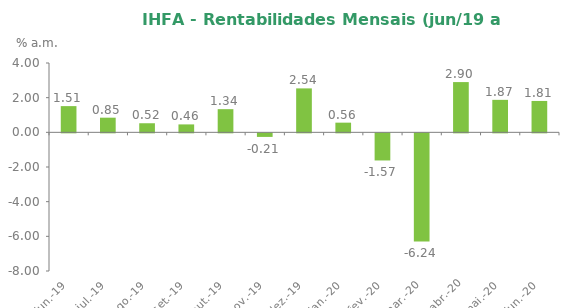
| Category | Series 0 |
|---|---|
| 2019-06-30 | 1.513 |
| 2019-07-31 | 0.845 |
| 2019-08-31 | 0.524 |
| 2019-09-30 | 0.457 |
| 2019-10-31 | 1.337 |
| 2019-11-30 | -0.207 |
| 2019-12-31 | 2.535 |
| 2020-01-31 | 0.558 |
| 2020-02-29 | -1.565 |
| 2020-03-31 | -6.239 |
| 2020-04-30 | 2.899 |
| 2020-05-31 | 1.874 |
| 2020-06-30 | 1.811 |